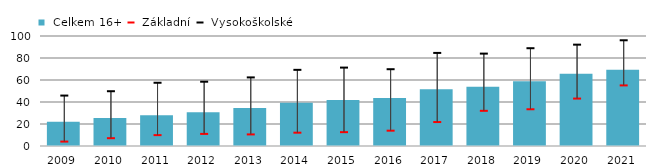
| Category |  Celkem 16+ |
|---|---|
| 2009.0 | 22 |
| 2010.0 | 25.4 |
| 2011.0 | 28 |
| 2012.0 | 30.645 |
| 2013.0 | 34.44 |
| 2014.0 | 39.287 |
| 2015.0 | 41.853 |
| 2016.0 | 43.626 |
| 2017.0 | 51.6 |
| 2018.0 | 53.9 |
| 2019.0 | 58.8 |
| 2020.0 | 65.7 |
| 2021.0 | 69.352 |